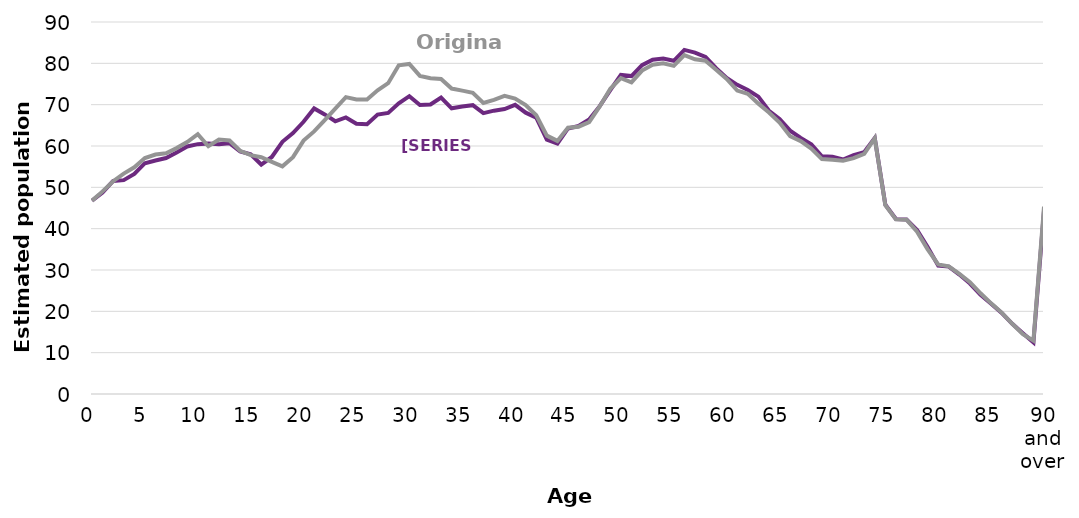
| Category | Rebased | Original |
|---|---|---|
| 0 | 46768 | 46782 |
| 1 | 48760 | 49017 |
| 2 | 51556 | 51478 |
| 3 | 51735 | 53317 |
| 4 | 53232 | 54843 |
| 5 | 55841 | 57070 |
| 6 | 56500 | 57945 |
| 7 | 57081 | 58262 |
| 8 | 58413 | 59490 |
| 9 | 59891 | 60960 |
| 10 | 60452 | 62868 |
| 11 | 60598 | 59950 |
| 12 | 60410 | 61557 |
| 13 | 60679 | 61334 |
| 14 | 58707 | 58857 |
| 15 | 57971 | 57792 |
| 16 | 55510 | 57280 |
| 17 | 57341 | 56179 |
| 18 | 61027 | 55074 |
| 19 | 63111 | 57305 |
| 20 | 65854 | 61314 |
| 21 | 69085 | 63526 |
| 22 | 67637 | 66277 |
| 23 | 65980 | 69034 |
| 24 | 66910 | 71827 |
| 25 | 65399 | 71242 |
| 26 | 65258 | 71264 |
| 27 | 67605 | 73491 |
| 28 | 68017 | 75198 |
| 29 | 70324 | 79523 |
| 30 | 72061 | 79853 |
| 31 | 69915 | 76958 |
| 32 | 70036 | 76395 |
| 33 | 71730 | 76227 |
| 34 | 69114 | 73900 |
| 35 | 69574 | 73404 |
| 36 | 69872 | 72855 |
| 37 | 67939 | 70423 |
| 38 | 68550 | 71179 |
| 39 | 68954 | 72113 |
| 40 | 69957 | 71460 |
| 41 | 68068 | 69923 |
| 42 | 66860 | 67428 |
| 43 | 61523 | 62504 |
| 44 | 60569 | 61236 |
| 45 | 64247 | 64443 |
| 46 | 64830 | 64670 |
| 47 | 66419 | 65770 |
| 48 | 69631 | 69572 |
| 49 | 73499 | 73843 |
| 50 | 77195 | 76442 |
| 51 | 76923 | 75420 |
| 52 | 79563 | 78255 |
| 53 | 80883 | 79663 |
| 54 | 81147 | 80011 |
| 55 | 80610 | 79389 |
| 56 | 83259 | 81987 |
| 57 | 82595 | 80973 |
| 58 | 81545 | 80622 |
| 59 | 78833 | 78439 |
| 60 | 76443 | 76225 |
| 61 | 74789 | 73417 |
| 62 | 73549 | 72636 |
| 63 | 71935 | 70250 |
| 64 | 68517 | 68098 |
| 65 | 66524 | 65670 |
| 66 | 63699 | 62371 |
| 67 | 61954 | 61188 |
| 68 | 60432 | 59360 |
| 69 | 57508 | 56835 |
| 70 | 57384 | 56692 |
| 71 | 56738 | 56433 |
| 72 | 57817 | 57056 |
| 73 | 58520 | 58119 |
| 74 | 61933 | 61854 |
| 75 | 45826 | 45663 |
| 76 | 42336 | 42249 |
| 77 | 42222 | 42149 |
| 78 | 39703 | 39250 |
| 79 | 35583 | 34988 |
| 80 | 31060 | 31336 |
| 81 | 30827 | 30894 |
| 82 | 28893 | 29041 |
| 83 | 26721 | 27044 |
| 84 | 23992 | 24360 |
| 85 | 21831 | 21934 |
| 86 | 19626 | 19692 |
| 87 | 16973 | 16983 |
| 88 | 14703 | 14476 |
| 89 | 12496 | 12903 |
| 90 and over | 44313 | 45321 |